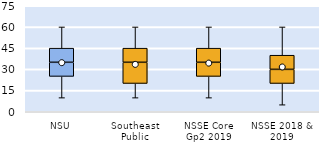
| Category | 25th | 50th | 75th |
|---|---|---|---|
| NSU | 25 | 10 | 10 |
| Southeast Public | 20 | 15 | 10 |
| NSSE Core Gp2 2019 | 25 | 10 | 10 |
| NSSE 2018 & 2019 | 20 | 10 | 10 |